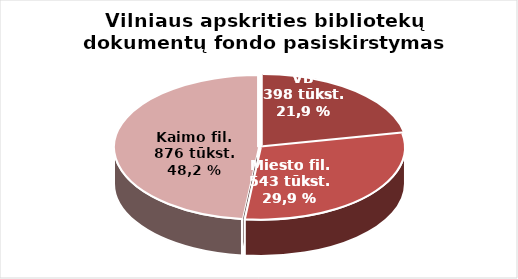
| Category | Series 0 |
|---|---|
| VB | 398105 |
| Miesto filialuose | 542949 |
| Kaimo filialuose | 876299 |